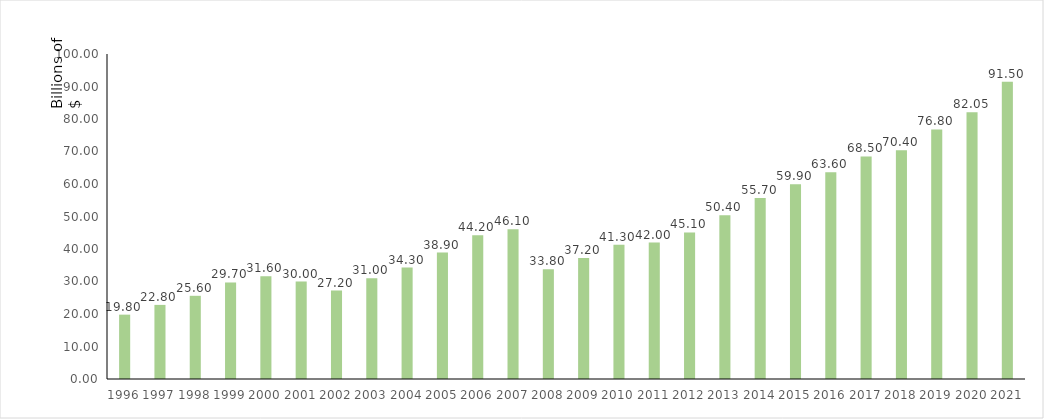
| Category | Mds $ |
|---|---|
| 1996.0 | 19.8 |
| 1997.0 | 22.8 |
| 1998.0 | 25.6 |
| 1999.0 | 29.7 |
| 2000.0 | 31.6 |
| 2001.0 | 30 |
| 2002.0 | 27.2 |
| 2003.0 | 31 |
| 2004.0 | 34.3 |
| 2005.0 | 38.9 |
| 2006.0 | 44.2 |
| 2007.0 | 46.1 |
| 2008.0 | 33.8 |
| 2009.0 | 37.2 |
| 2010.0 | 41.3 |
| 2011.0 | 42 |
| 2012.0 | 45.1 |
| 2013.0 | 50.4 |
| 2014.0 | 55.7 |
| 2015.0 | 59.9 |
| 2016.0 | 63.6 |
| 2017.0 | 68.5 |
| 2018.0 | 70.4 |
| 2019.0 | 76.8 |
| 2020.0 | 82.05 |
| 2021.0 | 91.5 |